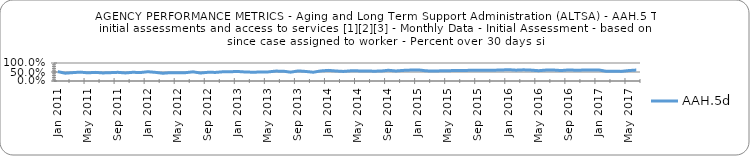
| Category | AAH.5d |
|---|---|
| 2011-01-01 | 0.519 |
| 2011-02-01 | 0.434 |
| 2011-03-01 | 0.465 |
| 2011-04-01 | 0.493 |
| 2011-05-01 | 0.454 |
| 2011-06-01 | 0.479 |
| 2011-07-01 | 0.448 |
| 2011-08-01 | 0.463 |
| 2011-09-01 | 0.482 |
| 2011-10-01 | 0.447 |
| 2011-11-01 | 0.484 |
| 2011-12-01 | 0.47 |
| 2012-01-01 | 0.515 |
| 2012-02-01 | 0.48 |
| 2012-03-01 | 0.43 |
| 2012-04-01 | 0.464 |
| 2012-05-01 | 0.453 |
| 2012-06-01 | 0.462 |
| 2012-07-01 | 0.509 |
| 2012-08-01 | 0.444 |
| 2012-09-01 | 0.484 |
| 2012-10-01 | 0.478 |
| 2012-11-01 | 0.512 |
| 2012-12-01 | 0.517 |
| 2013-01-01 | 0.527 |
| 2013-02-01 | 0.499 |
| 2013-03-01 | 0.489 |
| 2013-04-01 | 0.498 |
| 2013-05-01 | 0.504 |
| 2013-06-01 | 0.549 |
| 2013-07-01 | 0.547 |
| 2013-08-01 | 0.49 |
| 2013-09-01 | 0.562 |
| 2013-10-01 | 0.531 |
| 2013-11-01 | 0.487 |
| 2013-12-01 | 0.558 |
| 2014-01-01 | 0.59 |
| 2014-02-01 | 0.557 |
| 2014-03-01 | 0.532 |
| 2014-04-01 | 0.565 |
| 2014-05-01 | 0.562 |
| 2014-06-01 | 0.561 |
| 2014-07-01 | 0.546 |
| 2014-08-01 | 0.551 |
| 2014-09-01 | 0.596 |
| 2014-10-01 | 0.557 |
| 2014-11-01 | 0.589 |
| 2014-12-01 | 0.607 |
| 2015-01-01 | 0.617 |
| 2015-02-01 | 0.566 |
| 2015-03-01 | 0.551 |
| 2015-04-01 | 0.566 |
| 2015-05-01 | 0.572 |
| 2015-06-01 | 0.584 |
| 2015-07-01 | 0.576 |
| 2015-08-01 | 0.601 |
| 2015-09-01 | 0.603 |
| 2015-10-01 | 0.59 |
| 2015-11-01 | 0.601 |
| 2015-12-01 | 0.61 |
| 2016-01-01 | 0.629 |
| 2016-02-01 | 0.601 |
| 2016-03-01 | 0.62 |
| 2016-04-01 | 0.604 |
| 2016-05-01 | 0.572 |
| 2016-06-01 | 0.607 |
| 2016-07-01 | 0.61 |
| 2016-08-01 | 0.58 |
| 2016-09-01 | 0.615 |
| 2016-10-01 | 0.598 |
| 2016-11-01 | 0.607 |
| 2016-12-01 | 0.616 |
| 2017-01-01 | 0.613 |
| 2017-02-01 | 0.541 |
| 2017-03-01 | 0.547 |
| 2017-04-01 | 0.533 |
| 2017-05-01 | 0.58 |
| 2017-06-01 | 0.608 |